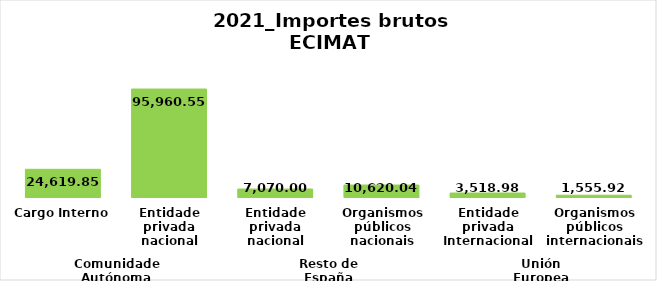
| Category | Series 0 |
|---|---|
| 0 | 24619.847 |
| 1 | 95960.545 |
| 2 | 7070 |
| 3 | 10620.04 |
| 4 | 3518.98 |
| 5 | 1555.92 |